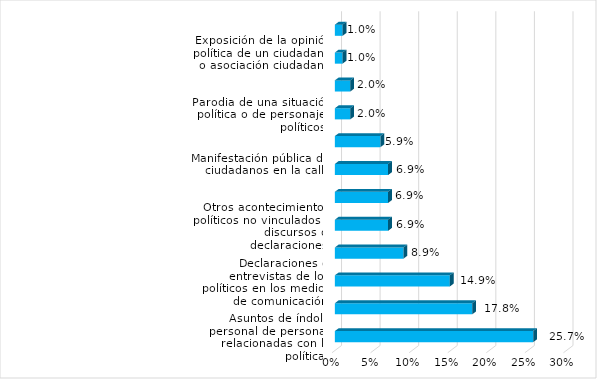
| Category | Porcentaje |
|---|---|
| Asuntos de índole personal de personas relacionadas con la política | 0.257 |
| Discursos políticos o intervenciones en instituciones legislativas | 0.178 |
| Declaraciones o entrevistas de los políticos en los medios de comunicación | 0.149 |
| Crítica, análisis o comentarios de las decisiones, acciones o declaraciones de un político | 0.089 |
| Otros acontecimientos políticos no vinculados a discursos o declaraciones | 0.069 |
| Exposición de la opinión política de un periodista | 0.069 |
| Manifestación pública de ciudadanos en la calle | 0.069 |
| Exposición de la opinión política de un artista o persona relacionada con la farándula | 0.059 |
| Parodia de una situación política o de personajes políticos | 0.02 |
| Entrevista que hace un ciudadano común a una persona relacionada con la política | 0.02 |
| Exposición de la opinión política de un ciudadano o asociación ciudadana | 0.01 |
| Acciones y mensajes de propaganda electoral | 0.01 |